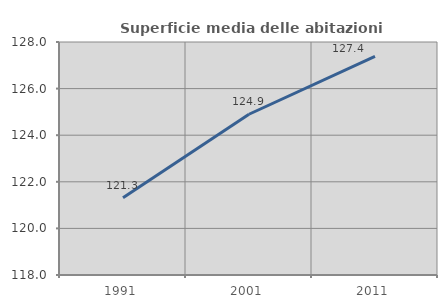
| Category | Superficie media delle abitazioni occupate |
|---|---|
| 1991.0 | 121.312 |
| 2001.0 | 124.899 |
| 2011.0 | 127.381 |